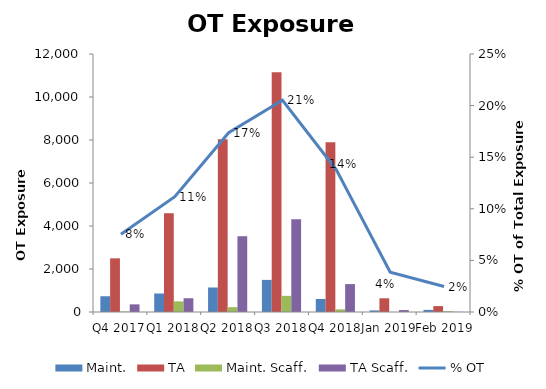
| Category | Maint. | TA | Maint. Scaff. | TA Scaff. |
|---|---|---|---|---|
| Q4 2017 | 733 | 2496 | 21 | 355.5 |
| Q1 2018 | 860.5 | 4596.5 | 494.5 | 639.5 |
| Q2 2018 | 1140.5 | 8033 | 224 | 3525 |
| Q3 2018 | 1493.5 | 11147 | 750.5 | 4319.5 |
| Q4 2018 | 606 | 7892.5 | 121.5 | 1298 |
| Jan 2019 | 74 | 638 | 0 | 90 |
| Feb 2019 | 98.5 | 275.5 | 36 | 8 |